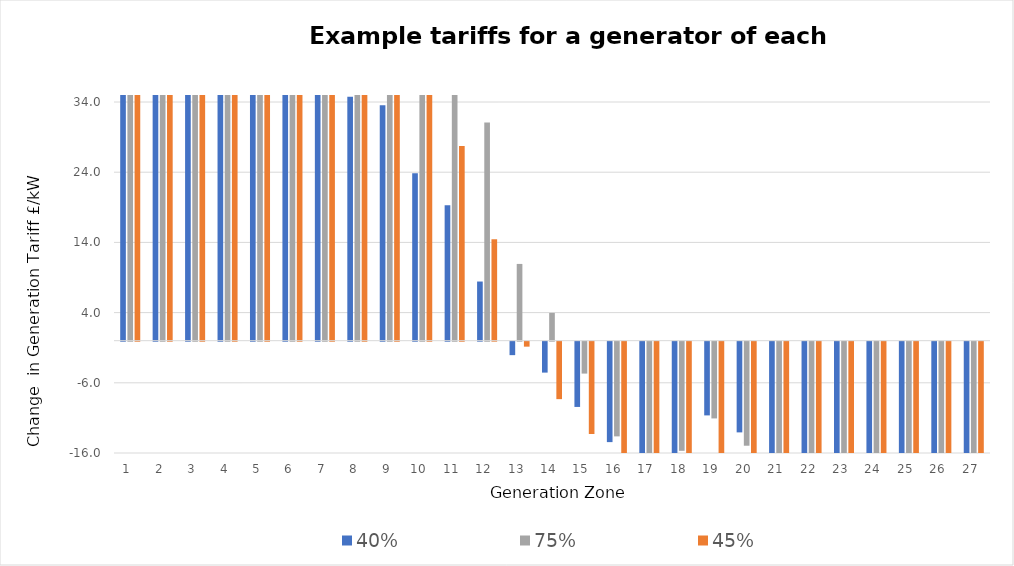
| Category | 40% | 75% | 45% |
|---|---|---|---|
| 1.0 | 54.841 | 114.114 | 70.771 |
| 2.0 | 46.828 | 101.132 | 63.777 |
| 3.0 | 45.305 | 96.246 | 58.182 |
| 4.0 | 48.243 | 104.524 | 67.084 |
| 5.0 | 48.094 | 102.792 | 63.874 |
| 6.0 | 38.397 | 80.742 | 44.809 |
| 7.0 | 39.609 | 86.971 | 53.193 |
| 8.0 | 34.764 | 75.329 | 42.06 |
| 9.0 | 33.536 | 75.024 | 43.483 |
| 10.0 | 23.837 | 60.307 | 35.831 |
| 11.0 | 19.28 | 50.895 | 27.738 |
| 12.0 | 8.427 | 31.097 | 14.449 |
| 13.0 | -1.917 | 10.935 | -0.707 |
| 14.0 | -4.405 | 3.96 | -8.185 |
| 15.0 | -9.296 | -4.545 | -13.151 |
| 16.0 | -14.307 | -13.489 | -18.982 |
| 17.0 | -19.157 | -17.428 | -17.656 |
| 18.0 | -18.405 | -15.547 | -16.006 |
| 19.0 | -10.501 | -10.933 | -20.589 |
| 20.0 | -12.921 | -14.821 | -22.548 |
| 21.0 | -18.784 | -20.69 | -22.556 |
| 22.0 | -22.759 | -28.387 | -29.795 |
| 23.0 | -23.738 | -22.519 | -18.384 |
| 24.0 | -25.894 | -26.293 | -21.079 |
| 25.0 | -26.845 | -29.141 | -23.507 |
| 26.0 | -19.326 | -22.18 | -24.409 |
| 27.0 | -21.776 | -22.812 | -21.434 |